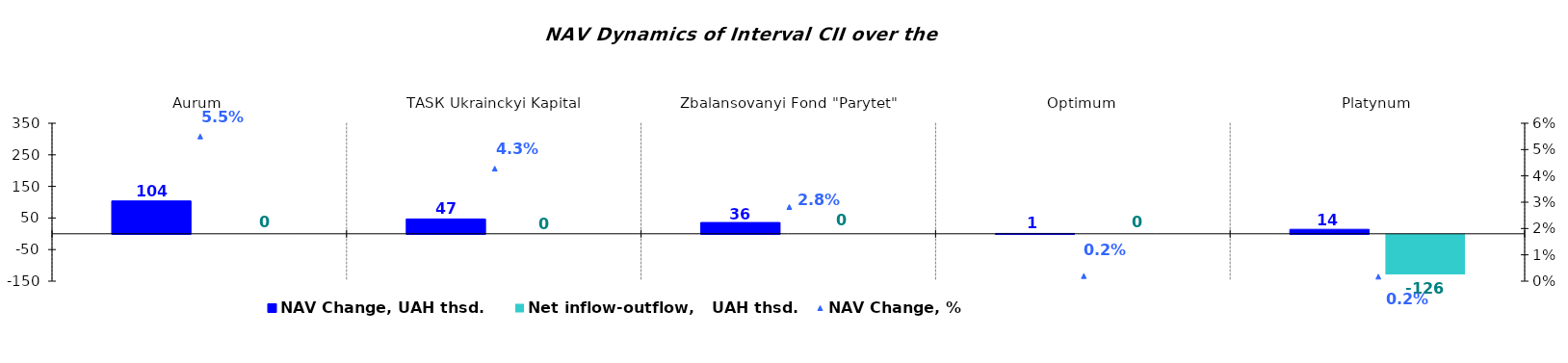
| Category | NAV Change, UAH thsd. | Net inflow-outflow,   UAH thsd. |
|---|---|---|
| Аurum | 104.008 | 0 |
| ТАSК Ukrainckyi Kapital | 46.947 | 0 |
| Zbalansovanyi Fond "Parytet" | 35.748 | 0 |
| Optimum | 1.1 | 0 |
| Platynum | 14.103 | -125.673 |